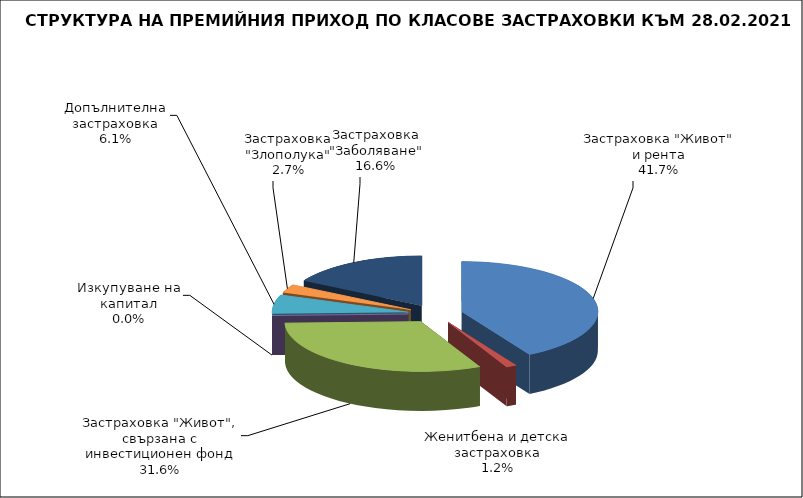
| Category | Series 0 |
|---|---|
| Застраховка "Живот" и рента | 40541396.184 |
| Женитбена и детска застраховка | 1197650.837 |
| Застраховка "Живот", свързана с инвестиционен фонд | 30729242.21 |
| Изкупуване на капитал | 0 |
| Допълнителна застраховка | 5930845.981 |
| Застраховка "Злополука" | 2669175.05 |
| Застраховка "Заболяване" | 16186128.19 |